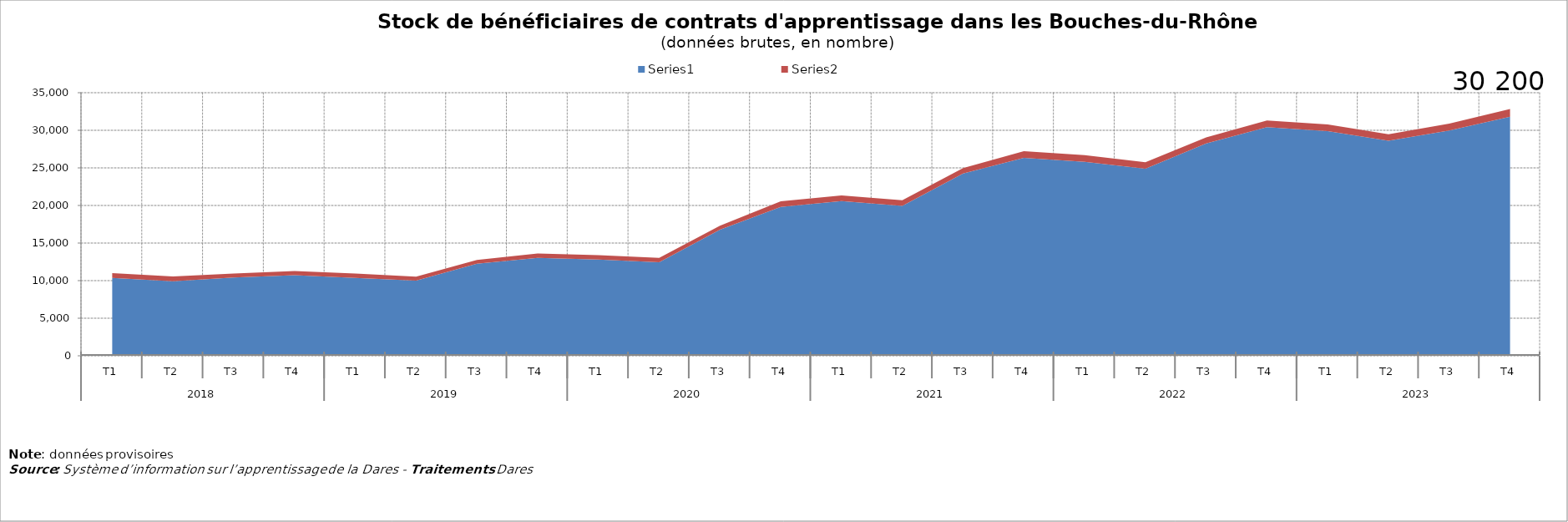
| Category | Series 0 | Series 1 |
|---|---|---|
| 0 | 10348 | 650 |
| 1 | 9917 | 642 |
| 2 | 10408 | 524 |
| 3 | 10713 | 575 |
| 4 | 10372 | 562 |
| 5 | 9989 | 550 |
| 6 | 12241 | 514 |
| 7 | 13022 | 593 |
| 8 | 12808 | 593 |
| 9 | 12442 | 588 |
| 10 | 16778 | 538 |
| 11 | 19814 | 730 |
| 12 | 20594 | 735 |
| 13 | 19958 | 732 |
| 14 | 24259 | 705 |
| 15 | 26331 | 895 |
| 16 | 25809 | 886 |
| 17 | 24899 | 862 |
| 18 | 28259 | 803 |
| 19 | 30427 | 884 |
| 20 | 29899 | 873 |
| 21 | 28609 | 859 |
| 22 | 29978 | 900 |
| 23 | 31807 | 1025 |